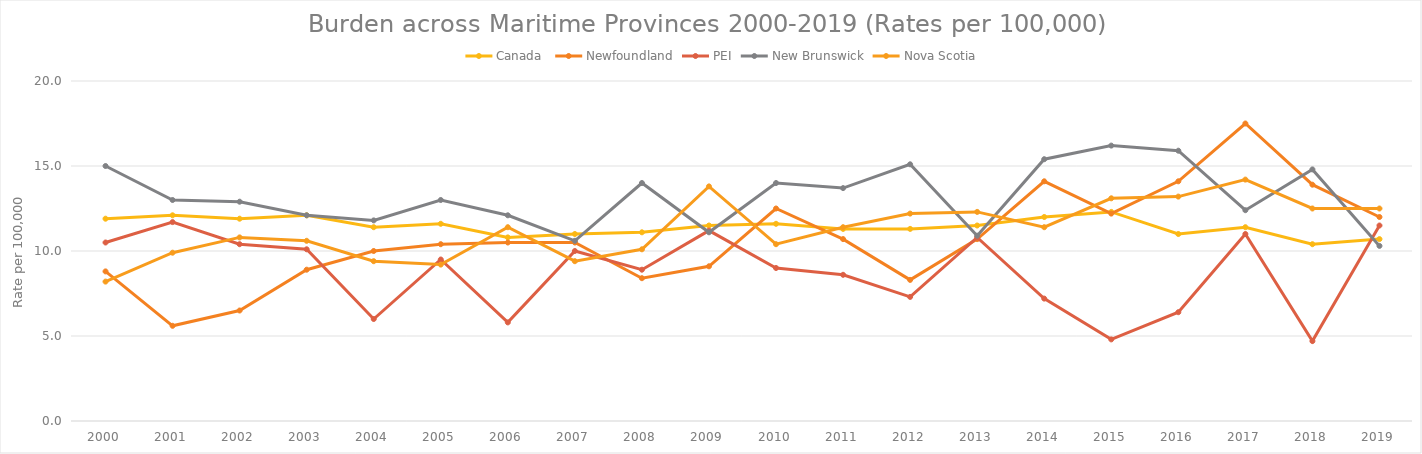
| Category | Canada  | Newfoundland | PEI | New Brunswick | Nova Scotia |
|---|---|---|---|---|---|
| 2000.0 | 11.9 | 8.8 | 10.5 | 15 | 8.2 |
| 2001.0 | 12.1 | 5.6 | 11.7 | 13 | 9.9 |
| 2002.0 | 11.9 | 6.5 | 10.4 | 12.9 | 10.8 |
| 2003.0 | 12.1 | 8.9 | 10.1 | 12.1 | 10.6 |
| 2004.0 | 11.4 | 10 | 6 | 11.8 | 9.4 |
| 2005.0 | 11.6 | 10.4 | 9.5 | 13 | 9.2 |
| 2006.0 | 10.8 | 10.5 | 5.8 | 12.1 | 11.4 |
| 2007.0 | 11 | 10.5 | 10 | 10.6 | 9.4 |
| 2008.0 | 11.1 | 8.4 | 8.9 | 14 | 10.1 |
| 2009.0 | 11.5 | 9.1 | 11.2 | 11.1 | 13.8 |
| 2010.0 | 11.6 | 12.5 | 9 | 14 | 10.4 |
| 2011.0 | 11.3 | 10.7 | 8.6 | 13.7 | 11.4 |
| 2012.0 | 11.3 | 8.3 | 7.3 | 15.1 | 12.2 |
| 2013.0 | 11.5 | 10.7 | 10.8 | 10.9 | 12.3 |
| 2014.0 | 12 | 14.1 | 7.2 | 15.4 | 11.4 |
| 2015.0 | 12.3 | 12.2 | 4.8 | 16.2 | 13.1 |
| 2016.0 | 11 | 14.1 | 6.4 | 15.9 | 13.2 |
| 2017.0 | 11.4 | 17.5 | 11 | 12.4 | 14.2 |
| 2018.0 | 10.4 | 13.9 | 4.7 | 14.8 | 12.5 |
| 2019.0 | 10.7 | 12 | 11.5 | 10.3 | 12.5 |